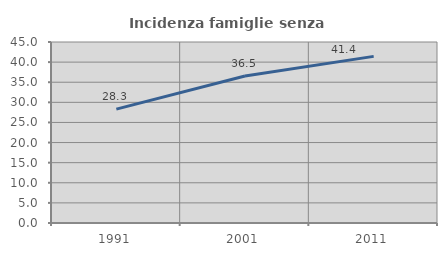
| Category | Incidenza famiglie senza nuclei |
|---|---|
| 1991.0 | 28.3 |
| 2001.0 | 36.534 |
| 2011.0 | 41.422 |